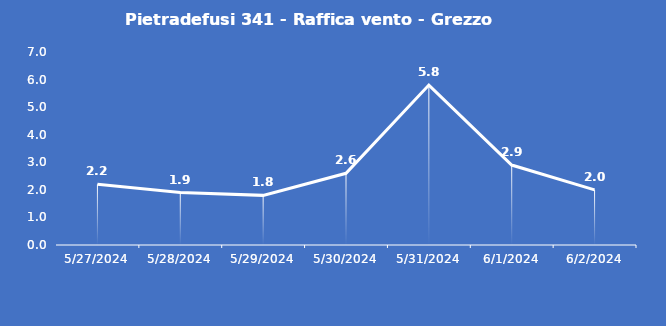
| Category | Pietradefusi 341 - Raffica vento - Grezzo (m/s) |
|---|---|
| 5/27/24 | 2.2 |
| 5/28/24 | 1.9 |
| 5/29/24 | 1.8 |
| 5/30/24 | 2.6 |
| 5/31/24 | 5.8 |
| 6/1/24 | 2.9 |
| 6/2/24 | 2 |